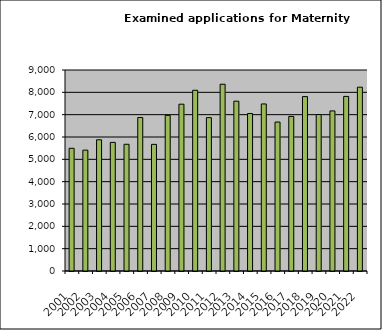
| Category | Series 0 |
|---|---|
| 2001.0 | 5494 |
| 2002.0 | 5411 |
| 2003.0 | 5875 |
| 2004.0 | 5759 |
| 2005.0 | 5674 |
| 2006.0 | 6873 |
| 2007.0 | 5670 |
| 2008.0 | 6968 |
| 2009.0 | 7469 |
| 2010.0 | 8093 |
| 2011.0 | 6867 |
| 2012.0 | 8362 |
| 2013.0 | 7603 |
| 2014.0 | 7051 |
| 2015.0 | 7480 |
| 2016.0 | 6669 |
| 2017.0 | 6921 |
| 2018.0 | 7808 |
| 2019.0 | 7006 |
| 2020.0 | 7168 |
| 2021.0 | 7817 |
| 2022.0 | 8230 |